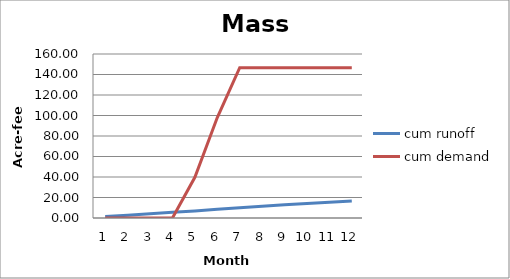
| Category | cum runoff | cum demand |
|---|---|---|
| 0 | 1.35 | 0 |
| 1 | 2.745 | 0 |
| 2 | 4.263 | 0 |
| 3 | 5.662 | 0 |
| 4 | 6.869 | 39.693 |
| 5 | 8.425 | 97.998 |
| 6 | 9.952 | 146.585 |
| 7 | 11.501 | 146.585 |
| 8 | 12.937 | 146.585 |
| 9 | 14.151 | 146.585 |
| 10 | 15.433 | 146.585 |
| 11 | 16.667 | 146.585 |